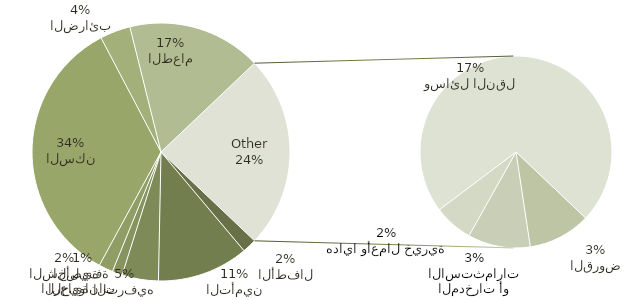
| Category | الإجمالي |
|---|---|
| الأطفال | 140 |
| التأمين | 900 |
| الترفيه | 358 |
| الحيوانات الأليفة | 100 |
| الرعاية الشخصية | 140 |
| السكن | 2702 |
| الضرائب | 300 |
| الطعام | 1320 |
| القروض | 200 |
| المدخرات أو الاستثمارات | 200 |
| هدايا وأعمال خيرية | 125 |
| وسائل النقل | 1375 |